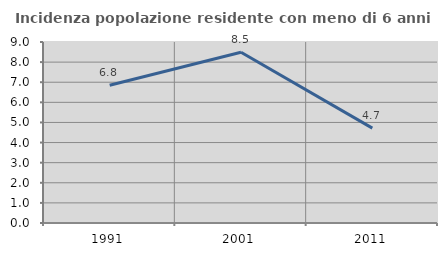
| Category | Incidenza popolazione residente con meno di 6 anni |
|---|---|
| 1991.0 | 6.849 |
| 2001.0 | 8.493 |
| 2011.0 | 4.72 |